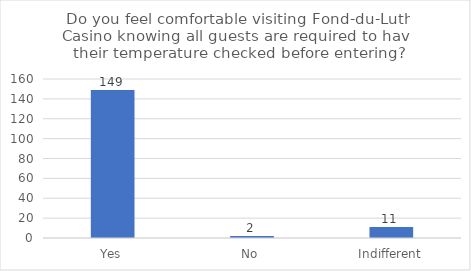
| Category | Series 0 |
|---|---|
| Yes | 149 |
| No | 2 |
| Indifferent | 11 |